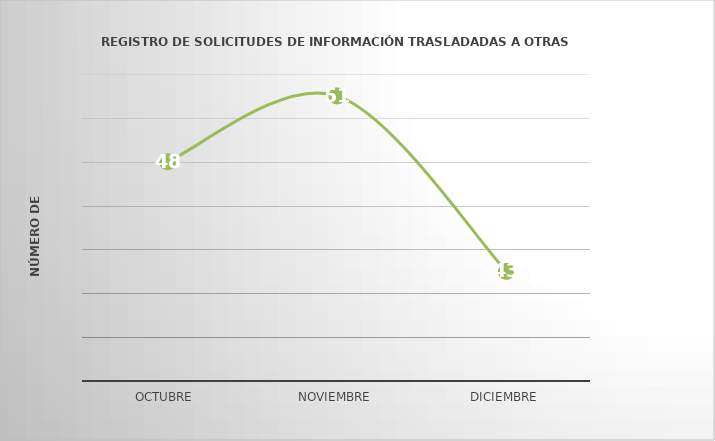
| Category | Series 0 |
|---|---|
| OCTUBRE | 48 |
| NOVIEMBRE | 51 |
| DICIEMBRE | 43 |